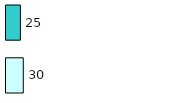
| Category | Series 0 | Series 1 |
|---|---|---|
| 0 | 30 | 25 |